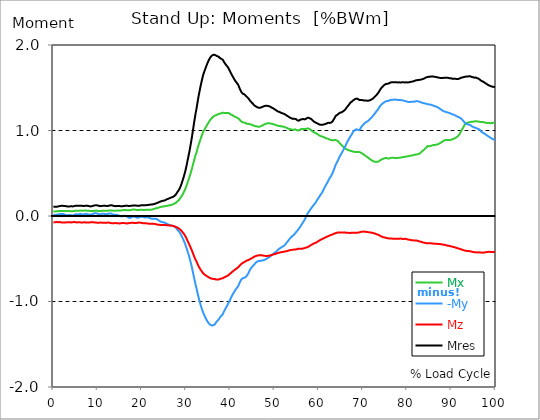
| Category |  Mx |  -My |  Mz |  Mres |
|---|---|---|---|---|
| 0.0 | 0.055 | 0.015 | -0.075 | 0.111 |
| 0.167348456675344 | 0.053 | 0.013 | -0.074 | 0.109 |
| 0.334696913350688 | 0.053 | 0.012 | -0.074 | 0.108 |
| 0.5020453700260321 | 0.053 | 0.013 | -0.072 | 0.108 |
| 0.669393826701376 | 0.055 | 0.015 | -0.071 | 0.108 |
| 0.83674228337672 | 0.056 | 0.018 | -0.071 | 0.109 |
| 1.0040907400520642 | 0.056 | 0.018 | -0.072 | 0.111 |
| 1.1621420602454444 | 0.058 | 0.018 | -0.071 | 0.112 |
| 1.3294905169207885 | 0.059 | 0.021 | -0.071 | 0.115 |
| 1.4968389735961325 | 0.059 | 0.022 | -0.072 | 0.117 |
| 1.6641874302714765 | 0.059 | 0.025 | -0.074 | 0.118 |
| 1.8315358869468206 | 0.059 | 0.024 | -0.075 | 0.119 |
| 1.9988843436221646 | 0.059 | 0.022 | -0.075 | 0.119 |
| 2.1662328002975086 | 0.059 | 0.022 | -0.075 | 0.119 |
| 2.333581256972853 | 0.059 | 0.022 | -0.075 | 0.118 |
| 2.5009297136481967 | 0.059 | 0.019 | -0.077 | 0.118 |
| 2.6682781703235405 | 0.058 | 0.015 | -0.077 | 0.117 |
| 2.8356266269988843 | 0.058 | 0.01 | -0.075 | 0.115 |
| 3.002975083674229 | 0.058 | 0.009 | -0.074 | 0.114 |
| 3.1703235403495724 | 0.058 | 0.009 | -0.072 | 0.112 |
| 3.337671997024917 | 0.058 | 0.01 | -0.072 | 0.111 |
| 3.4957233172182973 | 0.058 | 0.01 | -0.072 | 0.112 |
| 3.663071773893641 | 0.058 | 0.012 | -0.074 | 0.112 |
| 3.8304202305689854 | 0.058 | 0.01 | -0.075 | 0.114 |
| 3.997768687244329 | 0.056 | 0.009 | -0.075 | 0.114 |
| 4.165117143919673 | 0.056 | 0.006 | -0.074 | 0.114 |
| 4.332465600595017 | 0.056 | 0.006 | -0.072 | 0.112 |
| 4.499814057270361 | 0.058 | 0.007 | -0.071 | 0.114 |
| 4.667162513945706 | 0.059 | 0.012 | -0.071 | 0.115 |
| 4.834510970621049 | 0.06 | 0.018 | -0.071 | 0.118 |
| 5.001859427296393 | 0.06 | 0.021 | -0.072 | 0.119 |
| 5.169207883971737 | 0.06 | 0.021 | -0.074 | 0.121 |
| 5.336556340647081 | 0.06 | 0.019 | -0.075 | 0.121 |
| 5.503904797322425 | 0.06 | 0.019 | -0.075 | 0.121 |
| 5.671253253997769 | 0.06 | 0.018 | -0.074 | 0.119 |
| 5.82930457419115 | 0.06 | 0.019 | -0.074 | 0.118 |
| 5.996653030866494 | 0.062 | 0.024 | -0.074 | 0.119 |
| 6.164001487541838 | 0.063 | 0.025 | -0.075 | 0.121 |
| 6.331349944217181 | 0.063 | 0.022 | -0.077 | 0.121 |
| 6.498698400892526 | 0.062 | 0.018 | -0.077 | 0.119 |
| 6.66604685756787 | 0.062 | 0.016 | -0.075 | 0.118 |
| 6.833395314243213 | 0.062 | 0.018 | -0.074 | 0.118 |
| 7.000743770918558 | 0.063 | 0.021 | -0.074 | 0.118 |
| 7.168092227593902 | 0.063 | 0.025 | -0.074 | 0.119 |
| 7.335440684269246 | 0.063 | 0.027 | -0.075 | 0.121 |
| 7.50278914094459 | 0.063 | 0.027 | -0.077 | 0.121 |
| 7.6701375976199335 | 0.062 | 0.022 | -0.077 | 0.119 |
| 7.837486054295278 | 0.062 | 0.019 | -0.077 | 0.117 |
| 7.995537374488658 | 0.06 | 0.018 | -0.077 | 0.117 |
| 8.162885831164003 | 0.059 | 0.016 | -0.075 | 0.114 |
| 8.330234287839346 | 0.059 | 0.015 | -0.074 | 0.112 |
| 8.49758274451469 | 0.059 | 0.018 | -0.074 | 0.114 |
| 8.664931201190035 | 0.059 | 0.021 | -0.072 | 0.114 |
| 8.832279657865378 | 0.059 | 0.022 | -0.074 | 0.117 |
| 8.999628114540721 | 0.059 | 0.025 | -0.074 | 0.119 |
| 9.166976571216066 | 0.06 | 0.029 | -0.074 | 0.121 |
| 9.334325027891412 | 0.06 | 0.032 | -0.075 | 0.124 |
| 9.501673484566755 | 0.06 | 0.032 | -0.077 | 0.125 |
| 9.669021941242098 | 0.062 | 0.032 | -0.077 | 0.125 |
| 9.836370397917442 | 0.062 | 0.031 | -0.078 | 0.125 |
| 10.003718854592787 | 0.06 | 0.027 | -0.08 | 0.124 |
| 10.17106731126813 | 0.059 | 0.022 | -0.078 | 0.121 |
| 10.329118631461512 | 0.058 | 0.019 | -0.078 | 0.118 |
| 10.496467088136853 | 0.058 | 0.019 | -0.077 | 0.117 |
| 10.663815544812199 | 0.059 | 0.021 | -0.077 | 0.115 |
| 10.831164001487544 | 0.059 | 0.022 | -0.077 | 0.117 |
| 10.998512458162887 | 0.06 | 0.025 | -0.078 | 0.118 |
| 11.16586091483823 | 0.06 | 0.025 | -0.078 | 0.119 |
| 11.333209371513574 | 0.06 | 0.025 | -0.08 | 0.119 |
| 11.50055782818892 | 0.062 | 0.024 | -0.08 | 0.119 |
| 11.667906284864264 | 0.062 | 0.024 | -0.08 | 0.119 |
| 11.835254741539607 | 0.062 | 0.022 | -0.08 | 0.119 |
| 12.00260319821495 | 0.06 | 0.021 | -0.08 | 0.118 |
| 12.169951654890292 | 0.06 | 0.021 | -0.078 | 0.118 |
| 12.337300111565641 | 0.062 | 0.024 | -0.077 | 0.118 |
| 12.504648568240984 | 0.063 | 0.027 | -0.078 | 0.121 |
| 12.662699888434362 | 0.065 | 0.029 | -0.078 | 0.122 |
| 12.830048345109708 | 0.065 | 0.031 | -0.081 | 0.124 |
| 12.997396801785053 | 0.065 | 0.029 | -0.083 | 0.125 |
| 13.164745258460396 | 0.065 | 0.027 | -0.084 | 0.125 |
| 13.33209371513574 | 0.063 | 0.022 | -0.086 | 0.124 |
| 13.499442171811083 | 0.062 | 0.016 | -0.086 | 0.121 |
| 13.666790628486426 | 0.062 | 0.013 | -0.084 | 0.118 |
| 13.834139085161771 | 0.062 | 0.013 | -0.084 | 0.117 |
| 14.001487541837117 | 0.062 | 0.013 | -0.083 | 0.115 |
| 14.16883599851246 | 0.063 | 0.013 | -0.084 | 0.115 |
| 14.336184455187803 | 0.063 | 0.013 | -0.084 | 0.117 |
| 14.503532911863147 | 0.065 | 0.01 | -0.086 | 0.117 |
| 14.670881368538492 | 0.065 | 0.007 | -0.086 | 0.117 |
| 14.828932688731873 | 0.065 | 0.004 | -0.086 | 0.117 |
| 14.996281145407215 | 0.065 | 0.001 | -0.087 | 0.117 |
| 15.163629602082558 | 0.065 | -0.001 | -0.086 | 0.115 |
| 15.330978058757903 | 0.065 | -0.004 | -0.084 | 0.114 |
| 15.498326515433247 | 0.066 | -0.004 | -0.083 | 0.114 |
| 15.665674972108594 | 0.068 | -0.003 | -0.081 | 0.115 |
| 15.833023428783937 | 0.069 | 0 | -0.081 | 0.117 |
| 16.00037188545928 | 0.071 | 0.003 | -0.083 | 0.118 |
| 16.167720342134626 | 0.069 | 0.001 | -0.084 | 0.119 |
| 16.335068798809967 | 0.069 | -0.001 | -0.086 | 0.119 |
| 16.502417255485312 | 0.068 | -0.006 | -0.086 | 0.119 |
| 16.669765712160658 | 0.068 | -0.007 | -0.087 | 0.119 |
| 16.837114168836 | 0.068 | -0.013 | -0.086 | 0.119 |
| 17.004462625511344 | 0.068 | -0.018 | -0.084 | 0.118 |
| 17.16251394570472 | 0.068 | -0.021 | -0.083 | 0.118 |
| 17.32986240238007 | 0.068 | -0.022 | -0.081 | 0.118 |
| 17.497210859055414 | 0.069 | -0.019 | -0.08 | 0.118 |
| 17.664559315730756 | 0.072 | -0.015 | -0.08 | 0.119 |
| 17.8319077724061 | 0.074 | -0.01 | -0.08 | 0.121 |
| 17.999256229081443 | 0.075 | -0.006 | -0.08 | 0.122 |
| 18.166604685756788 | 0.075 | -0.006 | -0.081 | 0.122 |
| 18.333953142432133 | 0.075 | -0.007 | -0.083 | 0.124 |
| 18.501301599107478 | 0.074 | -0.01 | -0.083 | 0.124 |
| 18.668650055782823 | 0.072 | -0.015 | -0.083 | 0.122 |
| 18.835998512458165 | 0.071 | -0.018 | -0.081 | 0.121 |
| 19.00334696913351 | 0.069 | -0.021 | -0.08 | 0.119 |
| 19.170695425808855 | 0.069 | -0.021 | -0.077 | 0.119 |
| 19.338043882484197 | 0.071 | -0.018 | -0.077 | 0.119 |
| 19.496095202677576 | 0.071 | -0.013 | -0.077 | 0.121 |
| 19.66344365935292 | 0.072 | -0.009 | -0.078 | 0.122 |
| 19.830792116028263 | 0.072 | -0.006 | -0.08 | 0.124 |
| 19.998140572703612 | 0.072 | -0.007 | -0.081 | 0.127 |
| 20.165489029378953 | 0.072 | -0.009 | -0.084 | 0.127 |
| 20.3328374860543 | 0.071 | -0.012 | -0.084 | 0.127 |
| 20.500185942729644 | 0.071 | -0.015 | -0.084 | 0.125 |
| 20.667534399404985 | 0.071 | -0.018 | -0.084 | 0.125 |
| 20.83488285608033 | 0.071 | -0.016 | -0.084 | 0.125 |
| 21.002231312755672 | 0.072 | -0.015 | -0.086 | 0.127 |
| 21.16957976943102 | 0.072 | -0.013 | -0.087 | 0.128 |
| 21.336928226106362 | 0.072 | -0.013 | -0.088 | 0.128 |
| 21.504276682781704 | 0.072 | -0.016 | -0.09 | 0.13 |
| 21.67162513945705 | 0.072 | -0.021 | -0.09 | 0.131 |
| 21.82967645965043 | 0.074 | -0.024 | -0.091 | 0.134 |
| 21.997024916325774 | 0.074 | -0.028 | -0.091 | 0.134 |
| 22.16437337300112 | 0.074 | -0.031 | -0.091 | 0.134 |
| 22.33172182967646 | 0.075 | -0.034 | -0.09 | 0.134 |
| 22.499070286351806 | 0.078 | -0.032 | -0.091 | 0.136 |
| 22.666418743027148 | 0.081 | -0.032 | -0.091 | 0.139 |
| 22.833767199702496 | 0.084 | -0.031 | -0.091 | 0.142 |
| 23.00111565637784 | 0.087 | -0.031 | -0.093 | 0.143 |
| 23.168464113053183 | 0.09 | -0.031 | -0.096 | 0.146 |
| 23.335812569728528 | 0.091 | -0.034 | -0.099 | 0.15 |
| 23.50316102640387 | 0.094 | -0.038 | -0.1 | 0.153 |
| 23.670509483079215 | 0.096 | -0.046 | -0.102 | 0.156 |
| 23.83785793975456 | 0.099 | -0.055 | -0.103 | 0.161 |
| 23.995909259947936 | 0.102 | -0.059 | -0.103 | 0.165 |
| 24.163257716623285 | 0.105 | -0.065 | -0.105 | 0.17 |
| 24.330606173298627 | 0.106 | -0.068 | -0.105 | 0.171 |
| 24.49795462997397 | 0.108 | -0.069 | -0.105 | 0.174 |
| 24.665303086649313 | 0.111 | -0.072 | -0.105 | 0.177 |
| 24.83265154332466 | 0.111 | -0.074 | -0.105 | 0.178 |
| 25.0 | 0.112 | -0.075 | -0.105 | 0.18 |
| 25.167348456675345 | 0.114 | -0.078 | -0.106 | 0.183 |
| 25.334696913350694 | 0.115 | -0.081 | -0.106 | 0.186 |
| 25.502045370026035 | 0.118 | -0.088 | -0.108 | 0.192 |
| 25.669393826701377 | 0.119 | -0.091 | -0.108 | 0.195 |
| 25.836742283376722 | 0.121 | -0.096 | -0.109 | 0.199 |
| 26.004090740052067 | 0.122 | -0.1 | -0.109 | 0.202 |
| 26.17143919672741 | 0.124 | -0.103 | -0.111 | 0.206 |
| 26.329490516920792 | 0.125 | -0.108 | -0.111 | 0.209 |
| 26.49683897359613 | 0.128 | -0.111 | -0.112 | 0.212 |
| 26.66418743027148 | 0.13 | -0.112 | -0.112 | 0.217 |
| 26.831535886946828 | 0.133 | -0.114 | -0.114 | 0.22 |
| 26.998884343622166 | 0.136 | -0.117 | -0.115 | 0.223 |
| 27.166232800297514 | 0.139 | -0.119 | -0.118 | 0.227 |
| 27.333581256972852 | 0.143 | -0.122 | -0.121 | 0.233 |
| 27.5009297136482 | 0.146 | -0.125 | -0.122 | 0.239 |
| 27.668278170323543 | 0.153 | -0.134 | -0.127 | 0.249 |
| 27.835626626998888 | 0.162 | -0.146 | -0.131 | 0.263 |
| 28.002975083674233 | 0.17 | -0.158 | -0.134 | 0.276 |
| 28.170323540349575 | 0.177 | -0.168 | -0.14 | 0.289 |
| 28.33767199702492 | 0.184 | -0.177 | -0.145 | 0.301 |
| 28.50502045370026 | 0.195 | -0.189 | -0.15 | 0.317 |
| 28.663071773893645 | 0.206 | -0.201 | -0.158 | 0.335 |
| 28.830420230568986 | 0.217 | -0.215 | -0.167 | 0.355 |
| 28.99776868724433 | 0.232 | -0.233 | -0.176 | 0.379 |
| 29.165117143919673 | 0.246 | -0.252 | -0.187 | 0.407 |
| 29.33246560059502 | 0.263 | -0.27 | -0.196 | 0.434 |
| 29.499814057270367 | 0.279 | -0.291 | -0.208 | 0.462 |
| 29.66716251394571 | 0.296 | -0.311 | -0.221 | 0.493 |
| 29.834510970621054 | 0.317 | -0.333 | -0.236 | 0.525 |
| 30.00185942729639 | 0.339 | -0.358 | -0.254 | 0.563 |
| 30.169207883971744 | 0.363 | -0.383 | -0.27 | 0.602 |
| 30.33655634064708 | 0.389 | -0.413 | -0.291 | 0.646 |
| 30.50390479732243 | 0.416 | -0.438 | -0.308 | 0.687 |
| 30.671253253997772 | 0.441 | -0.466 | -0.326 | 0.732 |
| 30.829304574191156 | 0.468 | -0.496 | -0.345 | 0.774 |
| 30.996653030866494 | 0.494 | -0.532 | -0.364 | 0.823 |
| 31.164001487541842 | 0.524 | -0.565 | -0.385 | 0.872 |
| 31.331349944217187 | 0.555 | -0.603 | -0.406 | 0.925 |
| 31.498698400892525 | 0.588 | -0.645 | -0.428 | 0.982 |
| 31.666046857567874 | 0.621 | -0.686 | -0.45 | 1.038 |
| 31.833395314243212 | 0.655 | -0.727 | -0.472 | 1.096 |
| 32.00074377091856 | 0.684 | -0.765 | -0.494 | 1.149 |
| 32.1680922275939 | 0.715 | -0.807 | -0.513 | 1.202 |
| 32.33544068426925 | 0.737 | -0.839 | -0.529 | 1.245 |
| 32.50278914094459 | 0.77 | -0.876 | -0.549 | 1.298 |
| 32.670137597619934 | 0.802 | -0.914 | -0.569 | 1.351 |
| 32.83748605429528 | 0.83 | -0.951 | -0.587 | 1.401 |
| 33.004834510970625 | 0.857 | -0.984 | -0.603 | 1.445 |
| 33.162885831164004 | 0.882 | -1.016 | -0.617 | 1.488 |
| 33.33023428783935 | 0.909 | -1.049 | -0.631 | 1.531 |
| 33.497582744514695 | 0.931 | -1.074 | -0.643 | 1.568 |
| 33.664931201190036 | 0.956 | -1.1 | -0.656 | 1.606 |
| 33.83227965786538 | 0.979 | -1.124 | -0.668 | 1.642 |
| 33.99962811454073 | 0.997 | -1.145 | -0.677 | 1.671 |
| 34.16697657121607 | 1.012 | -1.165 | -0.684 | 1.695 |
| 34.33432502789141 | 1.027 | -1.183 | -0.69 | 1.718 |
| 34.50167348456676 | 1.041 | -1.201 | -0.696 | 1.742 |
| 34.6690219412421 | 1.056 | -1.217 | -0.704 | 1.765 |
| 34.83637039791744 | 1.072 | -1.232 | -0.708 | 1.786 |
| 35.00371885459279 | 1.086 | -1.245 | -0.714 | 1.807 |
| 35.17106731126814 | 1.1 | -1.257 | -0.718 | 1.824 |
| 35.338415767943474 | 1.114 | -1.265 | -0.723 | 1.841 |
| 35.49646708813686 | 1.125 | -1.273 | -0.727 | 1.855 |
| 35.6638155448122 | 1.137 | -1.279 | -0.73 | 1.867 |
| 35.831164001487544 | 1.147 | -1.282 | -0.733 | 1.878 |
| 35.998512458162885 | 1.155 | -1.282 | -0.735 | 1.882 |
| 36.165860914838234 | 1.162 | -1.277 | -0.736 | 1.883 |
| 36.333209371513576 | 1.17 | -1.274 | -0.737 | 1.886 |
| 36.50055782818892 | 1.174 | -1.267 | -0.737 | 1.885 |
| 36.667906284864266 | 1.177 | -1.255 | -0.742 | 1.881 |
| 36.83525474153961 | 1.18 | -1.24 | -0.743 | 1.875 |
| 37.002603198214956 | 1.184 | -1.23 | -0.743 | 1.87 |
| 37.1699516548903 | 1.189 | -1.223 | -0.743 | 1.869 |
| 37.337300111565646 | 1.193 | -1.212 | -0.742 | 1.864 |
| 37.50464856824098 | 1.196 | -1.202 | -0.74 | 1.858 |
| 37.66269988843437 | 1.196 | -1.187 | -0.736 | 1.847 |
| 37.83004834510971 | 1.199 | -1.174 | -0.733 | 1.839 |
| 37.99739680178505 | 1.204 | -1.165 | -0.733 | 1.838 |
| 38.16474525846039 | 1.208 | -1.158 | -0.73 | 1.835 |
| 38.33209371513574 | 1.208 | -1.146 | -0.727 | 1.826 |
| 38.49944217181109 | 1.205 | -1.124 | -0.721 | 1.808 |
| 38.666790628486424 | 1.204 | -1.108 | -0.717 | 1.795 |
| 38.83413908516178 | 1.204 | -1.091 | -0.712 | 1.782 |
| 39.001487541837115 | 1.204 | -1.075 | -0.708 | 1.77 |
| 39.16883599851246 | 1.205 | -1.06 | -0.704 | 1.76 |
| 39.336184455187805 | 1.205 | -1.044 | -0.701 | 1.749 |
| 39.503532911863154 | 1.206 | -1.028 | -0.696 | 1.739 |
| 39.670881368538495 | 1.204 | -1.01 | -0.689 | 1.723 |
| 39.83822982521384 | 1.196 | -0.994 | -0.68 | 1.704 |
| 39.996281145407224 | 1.192 | -0.975 | -0.673 | 1.686 |
| 40.163629602082565 | 1.187 | -0.954 | -0.665 | 1.668 |
| 40.33097805875791 | 1.183 | -0.938 | -0.658 | 1.652 |
| 40.498326515433256 | 1.178 | -0.922 | -0.65 | 1.637 |
| 40.6656749721086 | 1.173 | -0.907 | -0.643 | 1.621 |
| 40.83302342878393 | 1.168 | -0.892 | -0.637 | 1.606 |
| 41.00037188545929 | 1.162 | -0.878 | -0.63 | 1.591 |
| 41.16772034213463 | 1.158 | -0.863 | -0.624 | 1.578 |
| 41.33506879880997 | 1.155 | -0.851 | -0.617 | 1.566 |
| 41.50241725548531 | 1.15 | -0.841 | -0.611 | 1.556 |
| 41.66976571216066 | 1.146 | -0.83 | -0.605 | 1.544 |
| 41.837114168836 | 1.142 | -0.816 | -0.597 | 1.529 |
| 42.004462625511344 | 1.133 | -0.794 | -0.588 | 1.507 |
| 42.17181108218669 | 1.124 | -0.774 | -0.578 | 1.487 |
| 42.32986240238007 | 1.114 | -0.758 | -0.569 | 1.468 |
| 42.497210859055414 | 1.105 | -0.742 | -0.56 | 1.45 |
| 42.66455931573076 | 1.1 | -0.736 | -0.556 | 1.442 |
| 42.831907772406105 | 1.094 | -0.727 | -0.549 | 1.431 |
| 42.999256229081446 | 1.093 | -0.723 | -0.544 | 1.425 |
| 43.16660468575679 | 1.093 | -0.723 | -0.54 | 1.423 |
| 43.33395314243214 | 1.091 | -0.721 | -0.537 | 1.42 |
| 43.50130159910748 | 1.083 | -0.714 | -0.528 | 1.407 |
| 43.66865005578282 | 1.08 | -0.704 | -0.524 | 1.397 |
| 43.83599851245817 | 1.078 | -0.692 | -0.519 | 1.389 |
| 44.00334696913351 | 1.078 | -0.678 | -0.516 | 1.382 |
| 44.17069542580886 | 1.078 | -0.661 | -0.513 | 1.372 |
| 44.3380438824842 | 1.075 | -0.643 | -0.507 | 1.358 |
| 44.49609520267758 | 1.072 | -0.625 | -0.503 | 1.347 |
| 44.66344365935292 | 1.069 | -0.612 | -0.499 | 1.336 |
| 44.83079211602827 | 1.066 | -0.6 | -0.494 | 1.327 |
| 44.99814057270361 | 1.063 | -0.59 | -0.49 | 1.319 |
| 45.16548902937895 | 1.059 | -0.581 | -0.485 | 1.31 |
| 45.332837486054295 | 1.058 | -0.577 | -0.481 | 1.304 |
| 45.500185942729644 | 1.05 | -0.563 | -0.473 | 1.291 |
| 45.66753439940499 | 1.05 | -0.552 | -0.471 | 1.285 |
| 45.83488285608033 | 1.049 | -0.543 | -0.468 | 1.28 |
| 46.00223131275568 | 1.049 | -0.535 | -0.466 | 1.274 |
| 46.16957976943102 | 1.044 | -0.532 | -0.463 | 1.27 |
| 46.336928226106366 | 1.043 | -0.528 | -0.46 | 1.267 |
| 46.50427668278171 | 1.044 | -0.527 | -0.459 | 1.265 |
| 46.671625139457056 | 1.046 | -0.525 | -0.459 | 1.267 |
| 46.829676459650436 | 1.047 | -0.524 | -0.459 | 1.267 |
| 46.99702491632577 | 1.052 | -0.522 | -0.46 | 1.271 |
| 47.16437337300112 | 1.056 | -0.521 | -0.46 | 1.274 |
| 47.33172182967646 | 1.062 | -0.519 | -0.462 | 1.279 |
| 47.49907028635181 | 1.065 | -0.518 | -0.463 | 1.282 |
| 47.66641874302716 | 1.069 | -0.515 | -0.465 | 1.285 |
| 47.83376719970249 | 1.075 | -0.512 | -0.466 | 1.288 |
| 48.001115656377834 | 1.078 | -0.507 | -0.468 | 1.289 |
| 48.16846411305319 | 1.081 | -0.501 | -0.468 | 1.289 |
| 48.33581256972853 | 1.083 | -0.496 | -0.468 | 1.288 |
| 48.50316102640387 | 1.084 | -0.491 | -0.466 | 1.288 |
| 48.67050948307921 | 1.086 | -0.485 | -0.466 | 1.286 |
| 48.837857939754564 | 1.086 | -0.479 | -0.465 | 1.283 |
| 49.005206396429905 | 1.083 | -0.473 | -0.462 | 1.279 |
| 49.163257716623285 | 1.081 | -0.466 | -0.459 | 1.274 |
| 49.33060617329863 | 1.08 | -0.457 | -0.456 | 1.268 |
| 49.49795462997397 | 1.078 | -0.45 | -0.454 | 1.264 |
| 49.66530308664932 | 1.075 | -0.444 | -0.451 | 1.26 |
| 49.832651543324666 | 1.072 | -0.44 | -0.448 | 1.255 |
| 50.0 | 1.069 | -0.432 | -0.447 | 1.249 |
| 50.16734845667534 | 1.066 | -0.425 | -0.444 | 1.243 |
| 50.33469691335069 | 1.063 | -0.419 | -0.44 | 1.237 |
| 50.50204537002604 | 1.06 | -0.41 | -0.438 | 1.232 |
| 50.66939382670139 | 1.058 | -0.401 | -0.435 | 1.226 |
| 50.836742283376715 | 1.055 | -0.394 | -0.432 | 1.221 |
| 51.00409074005207 | 1.053 | -0.386 | -0.429 | 1.217 |
| 51.17143919672741 | 1.053 | -0.381 | -0.428 | 1.215 |
| 51.32949051692079 | 1.052 | -0.375 | -0.426 | 1.211 |
| 51.496838973596134 | 1.049 | -0.367 | -0.423 | 1.206 |
| 51.66418743027148 | 1.046 | -0.361 | -0.422 | 1.204 |
| 51.831535886946824 | 1.044 | -0.36 | -0.42 | 1.201 |
| 51.99888434362217 | 1.046 | -0.354 | -0.419 | 1.199 |
| 52.16623280029752 | 1.043 | -0.348 | -0.417 | 1.195 |
| 52.33358125697285 | 1.038 | -0.339 | -0.414 | 1.187 |
| 52.5009297136482 | 1.037 | -0.329 | -0.413 | 1.184 |
| 52.668278170323546 | 1.034 | -0.317 | -0.412 | 1.18 |
| 52.835626626998895 | 1.029 | -0.308 | -0.41 | 1.173 |
| 53.00297508367424 | 1.025 | -0.296 | -0.407 | 1.167 |
| 53.17032354034958 | 1.022 | -0.285 | -0.404 | 1.162 |
| 53.33767199702492 | 1.018 | -0.273 | -0.401 | 1.155 |
| 53.50502045370027 | 1.015 | -0.263 | -0.4 | 1.15 |
| 53.663071773893655 | 1.013 | -0.254 | -0.398 | 1.146 |
| 53.83042023056899 | 1.012 | -0.245 | -0.397 | 1.143 |
| 53.99776868724433 | 1.01 | -0.236 | -0.395 | 1.14 |
| 54.16511714391967 | 1.007 | -0.23 | -0.394 | 1.136 |
| 54.33246560059503 | 1.009 | -0.223 | -0.392 | 1.136 |
| 54.49981405727037 | 1.012 | -0.212 | -0.392 | 1.137 |
| 54.667162513945705 | 1.013 | -0.204 | -0.392 | 1.137 |
| 54.834510970621054 | 1.01 | -0.193 | -0.391 | 1.134 |
| 55.0018594272964 | 1.006 | -0.181 | -0.389 | 1.127 |
| 55.169207883971744 | 1.001 | -0.171 | -0.386 | 1.119 |
| 55.336556340647086 | 0.999 | -0.161 | -0.382 | 1.115 |
| 55.50390479732243 | 1 | -0.149 | -0.382 | 1.115 |
| 55.671253253997776 | 1.006 | -0.137 | -0.382 | 1.119 |
| 55.83860171067312 | 1.012 | -0.125 | -0.383 | 1.127 |
| 55.9966530308665 | 1.016 | -0.111 | -0.383 | 1.131 |
| 56.16400148754184 | 1.018 | -0.097 | -0.383 | 1.131 |
| 56.33134994421718 | 1.019 | -0.083 | -0.382 | 1.134 |
| 56.498698400892536 | 1.019 | -0.069 | -0.379 | 1.134 |
| 56.66604685756788 | 1.016 | -0.056 | -0.376 | 1.131 |
| 56.83339531424321 | 1.015 | -0.043 | -0.375 | 1.13 |
| 57.00074377091856 | 1.016 | -0.024 | -0.372 | 1.134 |
| 57.16809222759391 | 1.019 | -0.004 | -0.369 | 1.139 |
| 57.33544068426925 | 1.024 | 0.015 | -0.367 | 1.146 |
| 57.5027891409446 | 1.024 | 0.029 | -0.363 | 1.149 |
| 57.670137597619934 | 1.024 | 0.043 | -0.357 | 1.149 |
| 57.83748605429528 | 1.019 | 0.055 | -0.354 | 1.147 |
| 58.004834510970625 | 1.015 | 0.068 | -0.348 | 1.143 |
| 58.16288583116401 | 1.009 | 0.081 | -0.342 | 1.139 |
| 58.330234287839346 | 1.003 | 0.091 | -0.338 | 1.131 |
| 58.497582744514695 | 0.996 | 0.103 | -0.333 | 1.125 |
| 58.66493120119004 | 0.987 | 0.115 | -0.329 | 1.115 |
| 58.832279657865385 | 0.981 | 0.127 | -0.323 | 1.108 |
| 58.999628114540734 | 0.976 | 0.137 | -0.32 | 1.102 |
| 59.16697657121607 | 0.972 | 0.149 | -0.316 | 1.096 |
| 59.33432502789142 | 0.969 | 0.161 | -0.313 | 1.091 |
| 59.50167348456676 | 0.965 | 0.176 | -0.308 | 1.087 |
| 59.66902194124211 | 0.959 | 0.189 | -0.302 | 1.084 |
| 59.83637039791745 | 0.953 | 0.202 | -0.296 | 1.08 |
| 60.00371885459278 | 0.947 | 0.215 | -0.291 | 1.074 |
| 60.17106731126813 | 0.942 | 0.227 | -0.286 | 1.069 |
| 60.33841576794349 | 0.937 | 0.242 | -0.28 | 1.065 |
| 60.49646708813685 | 0.934 | 0.255 | -0.276 | 1.066 |
| 60.6638155448122 | 0.931 | 0.267 | -0.273 | 1.066 |
| 60.831164001487544 | 0.929 | 0.28 | -0.268 | 1.066 |
| 60.99851245816289 | 0.926 | 0.298 | -0.264 | 1.069 |
| 61.16586091483824 | 0.922 | 0.317 | -0.26 | 1.071 |
| 61.333209371513576 | 0.917 | 0.335 | -0.255 | 1.074 |
| 61.50055782818892 | 0.912 | 0.35 | -0.251 | 1.077 |
| 61.667906284864266 | 0.909 | 0.366 | -0.246 | 1.081 |
| 61.835254741539615 | 0.907 | 0.381 | -0.242 | 1.083 |
| 62.002603198214956 | 0.904 | 0.395 | -0.239 | 1.086 |
| 62.16995165489029 | 0.901 | 0.414 | -0.236 | 1.091 |
| 62.33730011156564 | 0.898 | 0.432 | -0.232 | 1.094 |
| 62.504648568240995 | 0.891 | 0.444 | -0.227 | 1.088 |
| 62.67199702491633 | 0.889 | 0.457 | -0.224 | 1.09 |
| 62.83004834510971 | 0.886 | 0.471 | -0.221 | 1.093 |
| 62.99739680178505 | 0.886 | 0.488 | -0.218 | 1.1 |
| 63.1647452584604 | 0.885 | 0.507 | -0.214 | 1.109 |
| 63.33209371513575 | 0.886 | 0.529 | -0.211 | 1.124 |
| 63.4994421718111 | 0.888 | 0.552 | -0.206 | 1.139 |
| 63.666790628486424 | 0.889 | 0.575 | -0.204 | 1.153 |
| 63.83413908516177 | 0.889 | 0.599 | -0.201 | 1.171 |
| 64.00148754183712 | 0.885 | 0.617 | -0.198 | 1.177 |
| 64.16883599851248 | 0.881 | 0.633 | -0.195 | 1.181 |
| 64.3361844551878 | 0.876 | 0.65 | -0.193 | 1.19 |
| 64.50353291186315 | 0.867 | 0.668 | -0.193 | 1.196 |
| 64.6708813685385 | 0.855 | 0.686 | -0.192 | 1.199 |
| 64.83822982521384 | 0.847 | 0.705 | -0.192 | 1.208 |
| 65.00557828188919 | 0.838 | 0.718 | -0.192 | 1.209 |
| 65.16362960208257 | 0.827 | 0.733 | -0.192 | 1.212 |
| 65.3309780587579 | 0.822 | 0.751 | -0.192 | 1.218 |
| 65.49832651543326 | 0.814 | 0.765 | -0.193 | 1.224 |
| 65.6656749721086 | 0.805 | 0.783 | -0.193 | 1.229 |
| 65.83302342878395 | 0.798 | 0.799 | -0.193 | 1.236 |
| 66.00037188545929 | 0.789 | 0.817 | -0.193 | 1.246 |
| 66.16772034213463 | 0.783 | 0.833 | -0.195 | 1.257 |
| 66.33506879880998 | 0.779 | 0.855 | -0.195 | 1.271 |
| 66.50241725548531 | 0.776 | 0.872 | -0.196 | 1.282 |
| 66.66976571216065 | 0.771 | 0.885 | -0.196 | 1.291 |
| 66.83711416883601 | 0.768 | 0.901 | -0.198 | 1.301 |
| 67.00446262551135 | 0.765 | 0.916 | -0.198 | 1.314 |
| 67.1718110821867 | 0.764 | 0.931 | -0.198 | 1.326 |
| 67.32986240238007 | 0.761 | 0.945 | -0.198 | 1.336 |
| 67.49721085905541 | 0.758 | 0.957 | -0.196 | 1.339 |
| 67.66455931573076 | 0.755 | 0.973 | -0.196 | 1.347 |
| 67.83190777240611 | 0.752 | 0.988 | -0.196 | 1.354 |
| 67.99925622908145 | 0.751 | 0.999 | -0.196 | 1.363 |
| 68.16660468575678 | 0.749 | 1.004 | -0.196 | 1.366 |
| 68.33395314243214 | 0.748 | 1.009 | -0.196 | 1.37 |
| 68.50130159910749 | 0.748 | 1.013 | -0.195 | 1.373 |
| 68.66865005578282 | 0.748 | 1.013 | -0.195 | 1.373 |
| 68.83599851245816 | 0.751 | 1.009 | -0.195 | 1.37 |
| 69.00334696913352 | 0.751 | 1.006 | -0.193 | 1.364 |
| 69.17069542580886 | 0.749 | 1.003 | -0.192 | 1.357 |
| 69.3380438824842 | 0.745 | 1.015 | -0.187 | 1.351 |
| 69.50539233915956 | 0.74 | 1.032 | -0.186 | 1.355 |
| 69.66344365935292 | 0.736 | 1.043 | -0.187 | 1.358 |
| 69.83079211602826 | 0.732 | 1.055 | -0.184 | 1.355 |
| 69.99814057270362 | 0.726 | 1.063 | -0.183 | 1.353 |
| 70.16548902937896 | 0.72 | 1.074 | -0.181 | 1.351 |
| 70.33283748605429 | 0.712 | 1.083 | -0.183 | 1.348 |
| 70.50018594272964 | 0.706 | 1.09 | -0.184 | 1.35 |
| 70.667534399405 | 0.701 | 1.097 | -0.186 | 1.351 |
| 70.83488285608033 | 0.695 | 1.102 | -0.187 | 1.35 |
| 71.00223131275568 | 0.689 | 1.108 | -0.187 | 1.348 |
| 71.16957976943102 | 0.683 | 1.112 | -0.189 | 1.348 |
| 71.33692822610637 | 0.676 | 1.118 | -0.19 | 1.35 |
| 71.50427668278171 | 0.668 | 1.128 | -0.192 | 1.353 |
| 71.67162513945706 | 0.662 | 1.139 | -0.193 | 1.357 |
| 71.8389735961324 | 0.656 | 1.147 | -0.193 | 1.36 |
| 71.99702491632577 | 0.65 | 1.156 | -0.195 | 1.364 |
| 72.16437337300113 | 0.645 | 1.165 | -0.198 | 1.37 |
| 72.33172182967647 | 0.64 | 1.177 | -0.199 | 1.378 |
| 72.49907028635181 | 0.637 | 1.187 | -0.202 | 1.385 |
| 72.66641874302715 | 0.634 | 1.198 | -0.205 | 1.394 |
| 72.8337671997025 | 0.633 | 1.209 | -0.208 | 1.403 |
| 73.00111565637783 | 0.634 | 1.221 | -0.212 | 1.413 |
| 73.16846411305319 | 0.634 | 1.232 | -0.215 | 1.422 |
| 73.33581256972853 | 0.634 | 1.242 | -0.218 | 1.431 |
| 73.50316102640387 | 0.637 | 1.255 | -0.22 | 1.444 |
| 73.67050948307921 | 0.642 | 1.27 | -0.224 | 1.457 |
| 73.83785793975457 | 0.65 | 1.283 | -0.23 | 1.473 |
| 74.00520639642991 | 0.655 | 1.294 | -0.232 | 1.485 |
| 74.16325771662328 | 0.661 | 1.304 | -0.239 | 1.499 |
| 74.33060617329863 | 0.665 | 1.311 | -0.243 | 1.509 |
| 74.49795462997398 | 0.667 | 1.317 | -0.246 | 1.515 |
| 74.66530308664932 | 0.671 | 1.324 | -0.248 | 1.525 |
| 74.83265154332466 | 0.676 | 1.33 | -0.251 | 1.532 |
| 75.00000000000001 | 0.677 | 1.335 | -0.254 | 1.537 |
| 75.16734845667534 | 0.678 | 1.342 | -0.255 | 1.544 |
| 75.3346969133507 | 0.678 | 1.344 | -0.257 | 1.546 |
| 75.50204537002605 | 0.674 | 1.344 | -0.26 | 1.546 |
| 75.66939382670138 | 0.673 | 1.345 | -0.261 | 1.546 |
| 75.83674228337672 | 0.674 | 1.348 | -0.263 | 1.55 |
| 76.00409074005208 | 0.674 | 1.353 | -0.264 | 1.555 |
| 76.17143919672742 | 0.677 | 1.357 | -0.264 | 1.56 |
| 76.33878765340276 | 0.68 | 1.36 | -0.264 | 1.563 |
| 76.49683897359614 | 0.681 | 1.358 | -0.264 | 1.563 |
| 76.66418743027148 | 0.683 | 1.357 | -0.264 | 1.563 |
| 76.83153588694682 | 0.681 | 1.358 | -0.265 | 1.563 |
| 76.99888434362218 | 0.68 | 1.36 | -0.267 | 1.565 |
| 77.16623280029752 | 0.68 | 1.361 | -0.267 | 1.565 |
| 77.33358125697285 | 0.678 | 1.361 | -0.267 | 1.565 |
| 77.5009297136482 | 0.678 | 1.361 | -0.267 | 1.565 |
| 77.66827817032356 | 0.678 | 1.358 | -0.267 | 1.563 |
| 77.83562662699889 | 0.68 | 1.357 | -0.265 | 1.562 |
| 78.00297508367423 | 0.68 | 1.357 | -0.265 | 1.563 |
| 78.17032354034959 | 0.681 | 1.358 | -0.265 | 1.563 |
| 78.33767199702493 | 0.683 | 1.355 | -0.264 | 1.563 |
| 78.50502045370027 | 0.683 | 1.355 | -0.264 | 1.562 |
| 78.67236891037561 | 0.683 | 1.355 | -0.265 | 1.563 |
| 78.83042023056899 | 0.684 | 1.354 | -0.267 | 1.563 |
| 78.99776868724433 | 0.689 | 1.353 | -0.268 | 1.565 |
| 79.16511714391969 | 0.69 | 1.35 | -0.27 | 1.565 |
| 79.33246560059503 | 0.69 | 1.348 | -0.265 | 1.562 |
| 79.49981405727036 | 0.692 | 1.345 | -0.265 | 1.562 |
| 79.66716251394571 | 0.695 | 1.342 | -0.267 | 1.562 |
| 79.83451097062107 | 0.696 | 1.341 | -0.27 | 1.563 |
| 80.00185942729641 | 0.698 | 1.338 | -0.273 | 1.563 |
| 80.16920788397174 | 0.699 | 1.335 | -0.276 | 1.562 |
| 80.33655634064709 | 0.701 | 1.333 | -0.277 | 1.563 |
| 80.50390479732243 | 0.701 | 1.333 | -0.277 | 1.565 |
| 80.67125325399778 | 0.705 | 1.333 | -0.28 | 1.566 |
| 80.83860171067312 | 0.706 | 1.335 | -0.282 | 1.569 |
| 80.99665303086651 | 0.708 | 1.336 | -0.282 | 1.572 |
| 81.16400148754184 | 0.708 | 1.335 | -0.283 | 1.572 |
| 81.3313499442172 | 0.709 | 1.335 | -0.285 | 1.574 |
| 81.49869840089255 | 0.714 | 1.335 | -0.286 | 1.577 |
| 81.66604685756786 | 0.717 | 1.338 | -0.286 | 1.581 |
| 81.83339531424322 | 0.718 | 1.341 | -0.288 | 1.584 |
| 82.00074377091858 | 0.72 | 1.342 | -0.288 | 1.587 |
| 82.16809222759392 | 0.72 | 1.344 | -0.288 | 1.588 |
| 82.33544068426926 | 0.721 | 1.342 | -0.289 | 1.588 |
| 82.50278914094459 | 0.724 | 1.341 | -0.292 | 1.59 |
| 82.67013759761994 | 0.727 | 1.339 | -0.295 | 1.593 |
| 82.83748605429528 | 0.733 | 1.336 | -0.298 | 1.593 |
| 83.00483451097062 | 0.737 | 1.333 | -0.299 | 1.593 |
| 83.17218296764597 | 0.746 | 1.329 | -0.302 | 1.596 |
| 83.33023428783935 | 0.757 | 1.324 | -0.307 | 1.599 |
| 83.4975827445147 | 0.763 | 1.322 | -0.308 | 1.602 |
| 83.66493120119004 | 0.768 | 1.323 | -0.31 | 1.608 |
| 83.83227965786537 | 0.773 | 1.319 | -0.313 | 1.608 |
| 83.99962811454073 | 0.785 | 1.316 | -0.314 | 1.612 |
| 84.16697657121607 | 0.794 | 1.314 | -0.316 | 1.618 |
| 84.33432502789142 | 0.801 | 1.313 | -0.319 | 1.621 |
| 84.50167348456677 | 0.81 | 1.31 | -0.32 | 1.624 |
| 84.6690219412421 | 0.819 | 1.307 | -0.32 | 1.628 |
| 84.83637039791745 | 0.819 | 1.305 | -0.32 | 1.628 |
| 85.0037188545928 | 0.816 | 1.305 | -0.32 | 1.628 |
| 85.17106731126813 | 0.816 | 1.305 | -0.32 | 1.63 |
| 85.33841576794349 | 0.819 | 1.304 | -0.32 | 1.631 |
| 85.50576422461883 | 0.822 | 1.299 | -0.32 | 1.631 |
| 85.66381554481221 | 0.826 | 1.296 | -0.32 | 1.633 |
| 85.83116400148755 | 0.83 | 1.292 | -0.322 | 1.633 |
| 85.99851245816289 | 0.83 | 1.289 | -0.323 | 1.63 |
| 86.16586091483823 | 0.83 | 1.286 | -0.324 | 1.628 |
| 86.33320937151358 | 0.83 | 1.283 | -0.324 | 1.627 |
| 86.50055782818893 | 0.833 | 1.28 | -0.324 | 1.625 |
| 86.66790628486427 | 0.836 | 1.279 | -0.324 | 1.625 |
| 86.83525474153961 | 0.838 | 1.273 | -0.326 | 1.622 |
| 87.00260319821496 | 0.839 | 1.267 | -0.326 | 1.618 |
| 87.16995165489031 | 0.844 | 1.263 | -0.327 | 1.617 |
| 87.33730011156564 | 0.85 | 1.257 | -0.327 | 1.617 |
| 87.504648568241 | 0.855 | 1.251 | -0.329 | 1.615 |
| 87.67199702491634 | 0.86 | 1.246 | -0.33 | 1.615 |
| 87.83004834510972 | 0.866 | 1.239 | -0.332 | 1.615 |
| 87.99739680178506 | 0.872 | 1.233 | -0.333 | 1.615 |
| 88.1647452584604 | 0.878 | 1.227 | -0.335 | 1.615 |
| 88.33209371513574 | 0.882 | 1.224 | -0.336 | 1.617 |
| 88.49944217181108 | 0.886 | 1.221 | -0.338 | 1.618 |
| 88.66679062848644 | 0.888 | 1.218 | -0.339 | 1.618 |
| 88.83413908516178 | 0.888 | 1.215 | -0.342 | 1.617 |
| 89.00148754183712 | 0.889 | 1.212 | -0.344 | 1.617 |
| 89.16883599851246 | 0.889 | 1.211 | -0.347 | 1.617 |
| 89.33618445518782 | 0.888 | 1.208 | -0.348 | 1.615 |
| 89.50353291186315 | 0.886 | 1.205 | -0.35 | 1.612 |
| 89.6708813685385 | 0.886 | 1.202 | -0.353 | 1.611 |
| 89.83822982521386 | 0.891 | 1.199 | -0.354 | 1.612 |
| 90.00557828188919 | 0.894 | 1.193 | -0.357 | 1.609 |
| 90.16362960208257 | 0.895 | 1.189 | -0.358 | 1.606 |
| 90.3309780587579 | 0.898 | 1.187 | -0.361 | 1.605 |
| 90.49832651543326 | 0.903 | 1.186 | -0.363 | 1.606 |
| 90.66567497210859 | 0.907 | 1.181 | -0.364 | 1.608 |
| 90.83302342878395 | 0.912 | 1.177 | -0.367 | 1.605 |
| 91.00037188545929 | 0.916 | 1.173 | -0.37 | 1.605 |
| 91.16772034213463 | 0.922 | 1.168 | -0.373 | 1.603 |
| 91.33506879880998 | 0.928 | 1.164 | -0.375 | 1.603 |
| 91.50241725548533 | 0.937 | 1.159 | -0.379 | 1.602 |
| 91.66976571216065 | 0.944 | 1.155 | -0.381 | 1.603 |
| 91.83711416883601 | 0.957 | 1.152 | -0.383 | 1.608 |
| 92.00446262551137 | 0.973 | 1.147 | -0.386 | 1.612 |
| 92.1718110821867 | 0.993 | 1.14 | -0.389 | 1.617 |
| 92.33915953886203 | 1.007 | 1.131 | -0.392 | 1.619 |
| 92.49721085905541 | 1.021 | 1.124 | -0.395 | 1.621 |
| 92.66455931573077 | 1.034 | 1.115 | -0.398 | 1.622 |
| 92.83190777240611 | 1.052 | 1.103 | -0.401 | 1.625 |
| 92.99925622908145 | 1.068 | 1.091 | -0.403 | 1.628 |
| 93.1666046857568 | 1.08 | 1.081 | -0.406 | 1.63 |
| 93.33395314243214 | 1.084 | 1.078 | -0.407 | 1.631 |
| 93.50130159910749 | 1.088 | 1.075 | -0.409 | 1.631 |
| 93.66865005578283 | 1.091 | 1.072 | -0.409 | 1.633 |
| 93.83599851245818 | 1.093 | 1.071 | -0.41 | 1.633 |
| 94.00334696913353 | 1.096 | 1.068 | -0.41 | 1.634 |
| 94.17069542580886 | 1.099 | 1.068 | -0.412 | 1.636 |
| 94.3380438824842 | 1.1 | 1.062 | -0.413 | 1.633 |
| 94.50539233915954 | 1.102 | 1.055 | -0.416 | 1.628 |
| 94.66344365935292 | 1.103 | 1.049 | -0.417 | 1.627 |
| 94.83079211602828 | 1.103 | 1.044 | -0.42 | 1.624 |
| 94.99814057270362 | 1.105 | 1.038 | -0.422 | 1.621 |
| 95.16548902937897 | 1.106 | 1.035 | -0.423 | 1.618 |
| 95.33283748605432 | 1.108 | 1.034 | -0.425 | 1.619 |
| 95.50018594272963 | 1.108 | 1.032 | -0.425 | 1.619 |
| 95.66753439940499 | 1.108 | 1.027 | -0.426 | 1.614 |
| 95.83488285608034 | 1.106 | 1.022 | -0.426 | 1.611 |
| 96.00223131275567 | 1.106 | 1.019 | -0.426 | 1.608 |
| 96.16957976943102 | 1.105 | 1.016 | -0.425 | 1.606 |
| 96.33692822610638 | 1.102 | 1.013 | -0.425 | 1.6 |
| 96.50427668278171 | 1.1 | 1.001 | -0.426 | 1.591 |
| 96.67162513945706 | 1.1 | 0.993 | -0.428 | 1.586 |
| 96.8389735961324 | 1.1 | 0.982 | -0.428 | 1.578 |
| 96.99702491632577 | 1.1 | 0.976 | -0.429 | 1.574 |
| 97.16437337300111 | 1.099 | 0.973 | -0.429 | 1.572 |
| 97.33172182967647 | 1.096 | 0.968 | -0.428 | 1.566 |
| 97.49907028635181 | 1.094 | 0.962 | -0.426 | 1.56 |
| 97.66641874302715 | 1.093 | 0.956 | -0.425 | 1.555 |
| 97.8337671997025 | 1.09 | 0.95 | -0.423 | 1.549 |
| 98.00111565637785 | 1.088 | 0.944 | -0.422 | 1.541 |
| 98.16846411305319 | 1.087 | 0.938 | -0.42 | 1.537 |
| 98.33581256972855 | 1.087 | 0.934 | -0.419 | 1.534 |
| 98.50316102640389 | 1.087 | 0.928 | -0.419 | 1.528 |
| 98.67050948307921 | 1.086 | 0.92 | -0.42 | 1.524 |
| 98.83785793975456 | 1.086 | 0.914 | -0.42 | 1.519 |
| 99.0052063964299 | 1.087 | 0.909 | -0.42 | 1.516 |
| 99.17255485310525 | 1.087 | 0.906 | -0.422 | 1.515 |
| 99.33060617329863 | 1.088 | 0.9 | -0.42 | 1.512 |
| 99.49795462997399 | 1.09 | 0.897 | -0.42 | 1.51 |
| 99.66530308664933 | 1.093 | 0.891 | -0.42 | 1.509 |
| 99.83265154332467 | 1.094 | 0.885 | -0.422 | 1.507 |
| 100.0 | 1.097 | 0.879 | -0.423 | 1.506 |